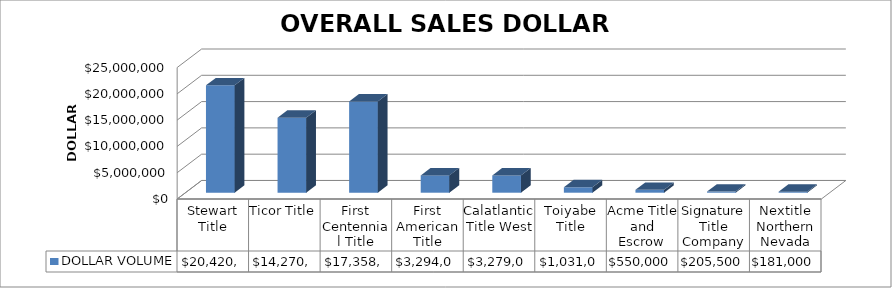
| Category | DOLLAR VOLUME |
|---|---|
| Stewart Title | 20420802.87 |
| Ticor Title | 14270632 |
| First Centennial Title | 17358968.66 |
| First American Title | 3294000 |
| Calatlantic Title West | 3279099 |
| Toiyabe Title | 1031000 |
| Acme Title and Escrow | 550000 |
| Signature Title Company | 205500 |
| Nextitle Northern Nevada | 181000 |